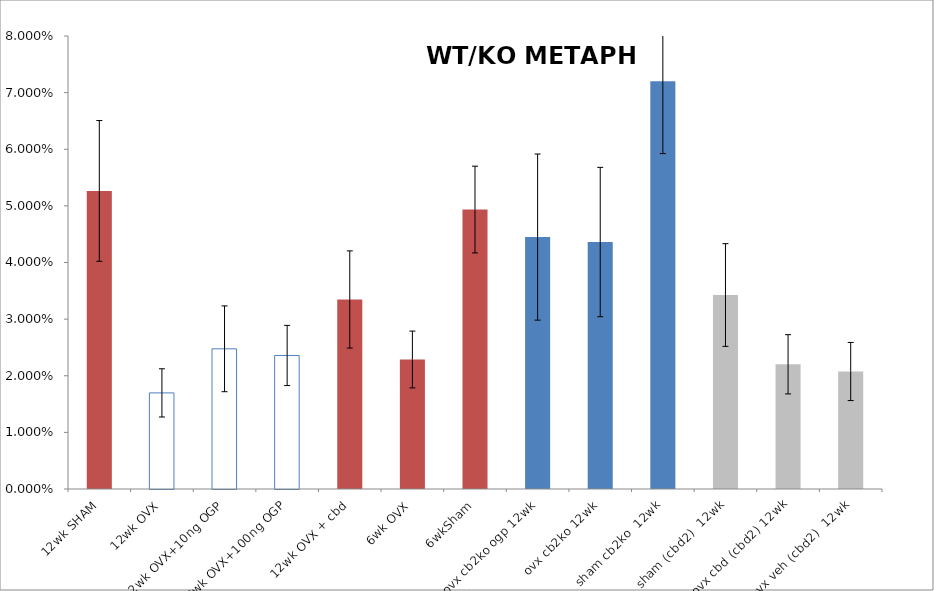
| Category | Series 0 |
|---|---|
| 12wk SHAM | 0.053 |
| 12wk OVX | 0.017 |
| 12wk OVX+10ng OGP | 0.025 |
| 12wk OVX+100ng OGP | 0.024 |
| 12wk OVX + cbd | 0.033 |
| 6wk OVX | 0.023 |
| 6wkSham | 0.049 |
| ovx cb2ko ogp 12wk | 0.044 |
| ovx cb2ko 12wk | 0.044 |
| sham cb2ko  12wk | 0.072 |
| sham (cbd2)  12wk | 0.034 |
| ovx cbd (cbd2) 12wk | 0.022 |
| ovx veh (cbd2)  12wk | 0.021 |